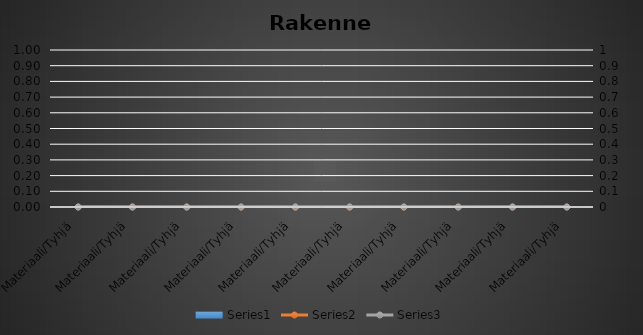
| Category | Series 0 |
|---|---|
| Materiaali/Tyhjä | 0 |
| Materiaali/Tyhjä | 0 |
| Materiaali/Tyhjä | 0 |
| Materiaali/Tyhjä | 0 |
| Materiaali/Tyhjä | 0 |
| Materiaali/Tyhjä | 0 |
| Materiaali/Tyhjä | 0 |
| Materiaali/Tyhjä | 0 |
| Materiaali/Tyhjä | 0 |
| Materiaali/Tyhjä | 0 |